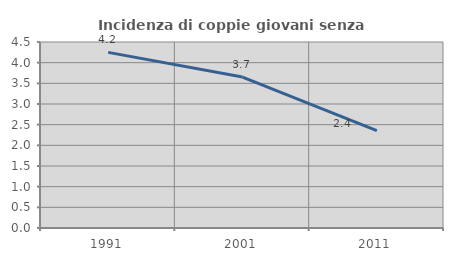
| Category | Incidenza di coppie giovani senza figli |
|---|---|
| 1991.0 | 4.249 |
| 2001.0 | 3.652 |
| 2011.0 | 2.358 |